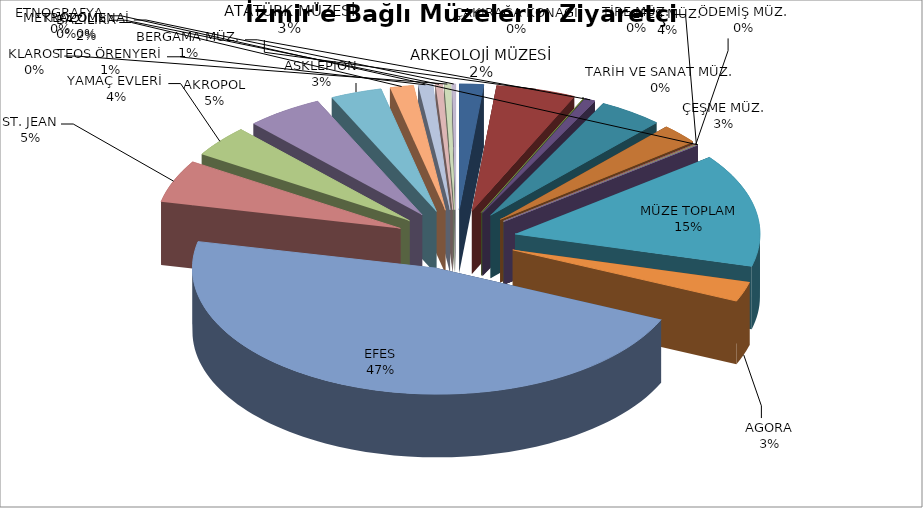
| Category | Series 0 |
|---|---|
| ARKEOLOJİ MÜZESİ | 30160 |
| ATATÜRK MÜZESİ | 98884 |
| TARİH VE SANAT MÜZ. | 235 |
| BERGAMA MÜZ. | 13596 |
| EFES MÜZ. | 79902 |
| ÇEŞME MÜZ. | 48060 |
| ÖDEMİŞ MÜZ. | 680 |
| TİRE MÜZ. | 0 |
| ÇAKIRAĞA KONAĞI | 2544 |
| ETNOGRAFYA | 0 |
| MÜZE TOPLAM | 274061 |
| AGORA | 47799 |
| EFES | 879292 |
| ST. JEAN | 102963 |
| YAMAÇ EVLERİ | 75894 |
| AKROPOL | 95334 |
| ASKLEPİON | 63709 |
| BAZİLİKA | 29114 |
| TEOS ÖRENYERİ | 18064 |
| METROPOLİS | 8655 |
| KLAROS | 7857 |
| KLAZOMENAİ | 4646 |